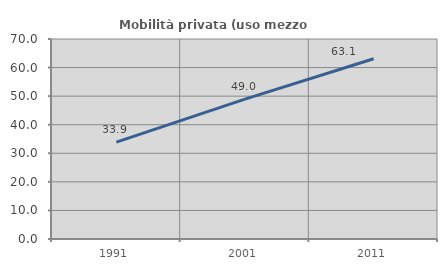
| Category | Mobilità privata (uso mezzo privato) |
|---|---|
| 1991.0 | 33.929 |
| 2001.0 | 48.977 |
| 2011.0 | 63.079 |